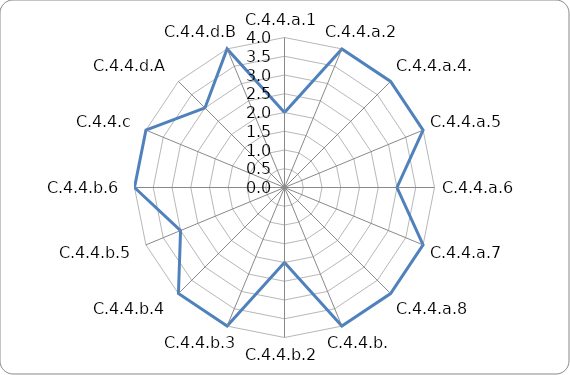
| Category | Series 0 |
|---|---|
| C.4.4.a.1 | 2 |
| C.4.4.a.2 | 4 |
| C.4.4.a.4. | 4 |
| C.4.4.a.5 | 4 |
| C.4.4.a.6 | 3 |
| C.4.4.a.7 | 4 |
| C.4.4.a.8 | 4 |
| C.4.4.b. | 4 |
| C.4.4.b.2 | 2 |
| C.4.4.b.3 | 4 |
| C.4.4.b.4 | 4 |
| C.4.4.b.5 | 3 |
| C.4.4.b.6 | 4 |
| C.4.4.c | 4 |
| C.4.4.d.A | 3 |
| C.4.4.d.B | 4 |